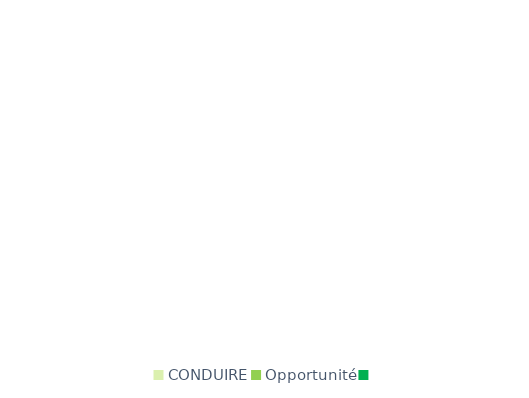
| Category | Series 0 |
|---|---|
| CONDUIRE | 0 |
| Opportunité | 0 |